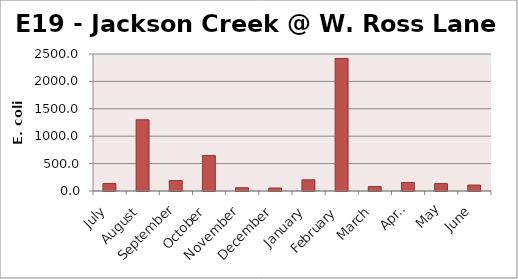
| Category | E. coli MPN |
|---|---|
| July | 137.4 |
| August | 1299.7 |
| September | 190.4 |
| October | 648.8 |
| November | 60.1 |
| December | 54.6 |
| January | 204.6 |
| February | 2419.2 |
| March | 82 |
| April | 157.6 |
| May | 135.4 |
| June | 109.2 |